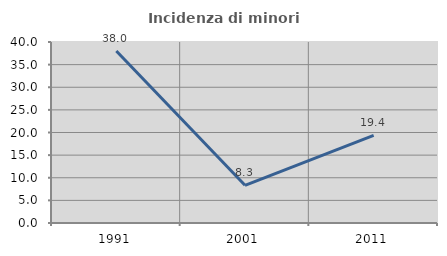
| Category | Incidenza di minori stranieri |
|---|---|
| 1991.0 | 38 |
| 2001.0 | 8.333 |
| 2011.0 | 19.38 |